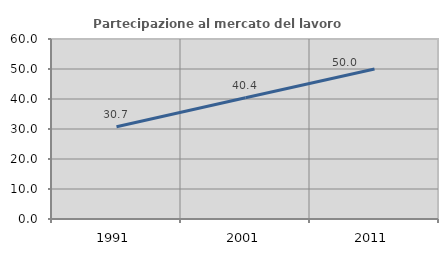
| Category | Partecipazione al mercato del lavoro  femminile |
|---|---|
| 1991.0 | 30.739 |
| 2001.0 | 40.441 |
| 2011.0 | 50 |